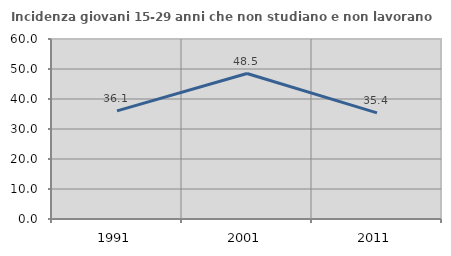
| Category | Incidenza giovani 15-29 anni che non studiano e non lavorano  |
|---|---|
| 1991.0 | 36.05 |
| 2001.0 | 48.493 |
| 2011.0 | 35.385 |